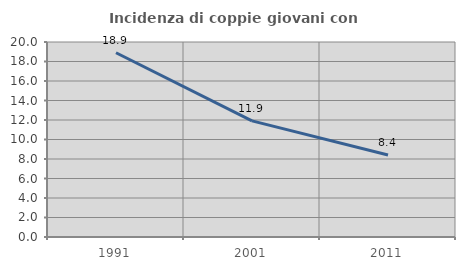
| Category | Incidenza di coppie giovani con figli |
|---|---|
| 1991.0 | 18.897 |
| 2001.0 | 11.914 |
| 2011.0 | 8.412 |